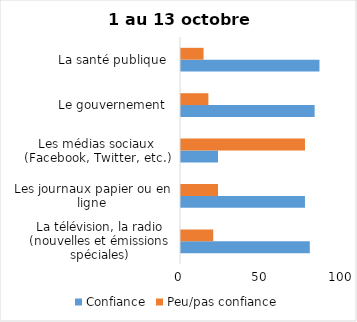
| Category | Confiance | Peu/pas confiance |
|---|---|---|
| La télévision, la radio (nouvelles et émissions spéciales) | 80 | 20 |
| Les journaux papier ou en ligne | 77 | 23 |
| Les médias sociaux (Facebook, Twitter, etc.) | 23 | 77 |
| Le gouvernement  | 83 | 17 |
| La santé publique  | 86 | 14 |